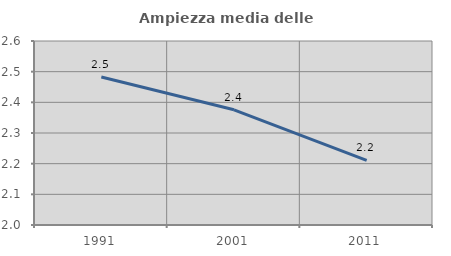
| Category | Ampiezza media delle famiglie |
|---|---|
| 1991.0 | 2.483 |
| 2001.0 | 2.376 |
| 2011.0 | 2.21 |